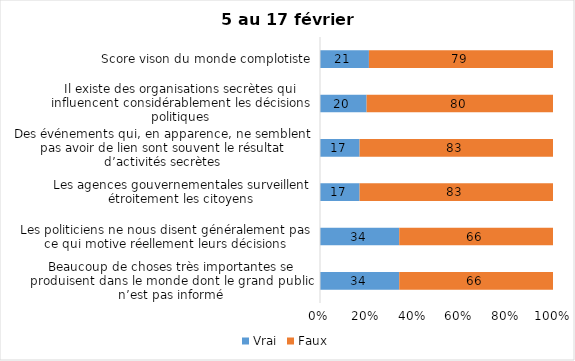
| Category | Vrai | Faux |
|---|---|---|
| Beaucoup de choses très importantes se produisent dans le monde dont le grand public n’est pas informé | 34 | 66 |
| Les politiciens ne nous disent généralement pas ce qui motive réellement leurs décisions | 34 | 66 |
| Les agences gouvernementales surveillent étroitement les citoyens | 17 | 83 |
| Des événements qui, en apparence, ne semblent pas avoir de lien sont souvent le résultat d’activités secrètes | 17 | 83 |
| Il existe des organisations secrètes qui influencent considérablement les décisions politiques | 20 | 80 |
| Score vison du monde complotiste | 21 | 79 |